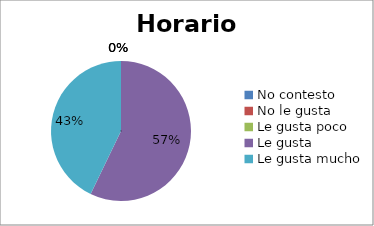
| Category | Series 0 |
|---|---|
| No contesto | 0 |
| No le gusta | 0 |
| Le gusta poco | 0 |
| Le gusta | 4 |
| Le gusta mucho | 3 |